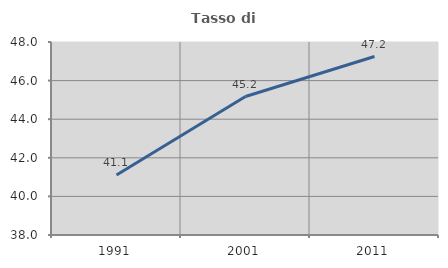
| Category | Tasso di occupazione   |
|---|---|
| 1991.0 | 41.106 |
| 2001.0 | 45.175 |
| 2011.0 | 47.246 |